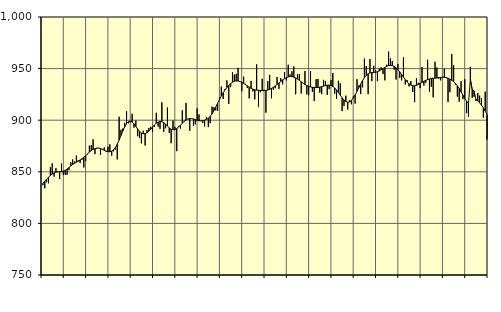
| Category | Piggar | Series 1 |
|---|---|---|
| nan | 837 | 838.9 |
| 1.0 | 834 | 840.96 |
| 1.0 | 839.9 | 842.87 |
| 1.0 | 838.9 | 844.65 |
| 1.0 | 854.4 | 846.36 |
| 1.0 | 858.2 | 847.87 |
| 1.0 | 845.3 | 848.96 |
| 1.0 | 853.5 | 849.65 |
| 1.0 | 850.2 | 849.94 |
| 1.0 | 843.1 | 850.06 |
| 1.0 | 858 | 850.23 |
| 1.0 | 846.8 | 850.65 |
| nan | 847.2 | 851.45 |
| 2.0 | 847.1 | 852.67 |
| 2.0 | 851.6 | 854.14 |
| 2.0 | 859.2 | 855.68 |
| 2.0 | 862 | 857.07 |
| 2.0 | 859.9 | 858.26 |
| 2.0 | 865.7 | 859.32 |
| 2.0 | 861.2 | 860.35 |
| 2.0 | 858.5 | 861.45 |
| 2.0 | 861.7 | 862.71 |
| 2.0 | 854.2 | 864.14 |
| 2.0 | 860.4 | 865.7 |
| nan | 866.9 | 867.37 |
| 3.0 | 875.4 | 869.02 |
| 3.0 | 875.8 | 870.52 |
| 3.0 | 881.5 | 871.74 |
| 3.0 | 867.1 | 872.55 |
| 3.0 | 872.2 | 872.94 |
| 3.0 | 873.2 | 872.95 |
| 3.0 | 866.4 | 872.54 |
| 3.0 | 871.2 | 871.82 |
| 3.0 | 873.6 | 870.94 |
| 3.0 | 869.3 | 870.08 |
| 3.0 | 874.2 | 869.51 |
| nan | 876.6 | 869.43 |
| 4.0 | 865.7 | 869.99 |
| 4.0 | 869.8 | 871.36 |
| 4.0 | 871.4 | 873.59 |
| 4.0 | 862 | 876.74 |
| 4.0 | 903.3 | 880.7 |
| 4.0 | 890.7 | 885.12 |
| 4.0 | 892 | 889.56 |
| 4.0 | 897.5 | 893.59 |
| 4.0 | 908.7 | 896.74 |
| 4.0 | 897 | 898.63 |
| 4.0 | 897.9 | 899.1 |
| nan | 906.2 | 898.25 |
| 5.0 | 892.8 | 896.38 |
| 5.0 | 899.6 | 893.91 |
| 5.0 | 884.5 | 891.32 |
| 5.0 | 882.8 | 889.13 |
| 5.0 | 877.5 | 887.59 |
| 5.0 | 889.8 | 886.86 |
| 5.0 | 875.5 | 887.01 |
| 5.0 | 890.4 | 887.88 |
| 5.0 | 892.5 | 889.34 |
| 5.0 | 893.6 | 891.27 |
| 5.0 | 888.7 | 893.39 |
| nan | 893.5 | 895.38 |
| 6.0 | 907.2 | 897.06 |
| 6.0 | 893.7 | 898.25 |
| 6.0 | 891.6 | 898.79 |
| 6.0 | 917.3 | 898.6 |
| 6.0 | 888.7 | 897.68 |
| 6.0 | 892.2 | 896.13 |
| 6.0 | 912.3 | 894.28 |
| 6.0 | 887.7 | 892.57 |
| 6.0 | 877.7 | 891.29 |
| 6.0 | 899.7 | 890.71 |
| 6.0 | 893.5 | 890.95 |
| nan | 870 | 891.92 |
| 7.0 | 894.2 | 893.39 |
| 7.0 | 891.8 | 895.15 |
| 7.0 | 909.6 | 897.02 |
| 7.0 | 899.4 | 898.79 |
| 7.0 | 916.7 | 900.19 |
| 7.0 | 900.9 | 901.18 |
| 7.0 | 889.7 | 901.67 |
| 7.0 | 901.7 | 901.61 |
| 7.0 | 894.6 | 901.2 |
| 7.0 | 896 | 900.57 |
| 7.0 | 911.4 | 899.92 |
| nan | 905.6 | 899.49 |
| 8.0 | 899.3 | 899.35 |
| 8.0 | 897.4 | 899.5 |
| 8.0 | 893.9 | 899.96 |
| 8.0 | 902.9 | 900.75 |
| 8.0 | 893.3 | 901.95 |
| 8.0 | 897.1 | 903.68 |
| 8.0 | 913.1 | 906.1 |
| 8.0 | 912.5 | 909.22 |
| 8.0 | 909.6 | 912.77 |
| 8.0 | 909.2 | 916.48 |
| 8.0 | 921.9 | 920.09 |
| nan | 932.6 | 923.45 |
| 9.0 | 920.5 | 926.51 |
| 9.0 | 930.3 | 929.25 |
| 9.0 | 938.6 | 931.67 |
| 9.0 | 915.9 | 933.79 |
| 9.0 | 932.1 | 935.52 |
| 9.0 | 946.4 | 936.84 |
| 9.0 | 944.2 | 937.75 |
| 9.0 | 944.9 | 938.07 |
| 9.0 | 950.7 | 937.96 |
| 9.0 | 937.7 | 937.51 |
| 9.0 | 928 | 936.72 |
| nan | 942.2 | 935.61 |
| 10.0 | 935.2 | 934.42 |
| 10.0 | 931.2 | 933.25 |
| 10.0 | 921.1 | 932.05 |
| 10.0 | 938.1 | 930.94 |
| 10.0 | 927.9 | 930.08 |
| 10.0 | 920.2 | 929.51 |
| 10.0 | 954.1 | 929.16 |
| 10.0 | 912.7 | 928.96 |
| 10.0 | 927.1 | 928.79 |
| 10.0 | 940.1 | 928.68 |
| 10.0 | 929.4 | 928.7 |
| nan | 907.3 | 928.88 |
| 11.0 | 937.9 | 929.25 |
| 11.0 | 943.9 | 929.88 |
| 11.0 | 921.3 | 930.77 |
| 11.0 | 929.5 | 931.86 |
| 11.0 | 931 | 933.13 |
| 11.0 | 941.8 | 934.58 |
| 11.0 | 930.4 | 936.07 |
| 11.0 | 940.9 | 937.54 |
| 11.0 | 934.7 | 939.03 |
| 11.0 | 946.6 | 940.28 |
| 11.0 | 938.5 | 941.26 |
| nan | 953.7 | 942.01 |
| 12.0 | 944.3 | 942.38 |
| 12.0 | 947.4 | 942.25 |
| 12.0 | 952.2 | 941.75 |
| 12.0 | 925.1 | 940.98 |
| 12.0 | 944.7 | 939.89 |
| 12.0 | 944.8 | 938.59 |
| 12.0 | 925.9 | 937.22 |
| 12.0 | 936.1 | 935.88 |
| 12.0 | 947.7 | 934.63 |
| 12.0 | 925 | 933.58 |
| 12.0 | 924.2 | 932.79 |
| nan | 947.6 | 932.26 |
| 13.0 | 927.5 | 931.88 |
| 13.0 | 918.5 | 931.63 |
| 13.0 | 939.7 | 931.59 |
| 13.0 | 939.9 | 931.74 |
| 13.0 | 926.7 | 932.05 |
| 13.0 | 925.3 | 932.47 |
| 13.0 | 939.1 | 933.01 |
| 13.0 | 938 | 933.56 |
| 13.0 | 924.5 | 933.94 |
| 13.0 | 930.1 | 933.98 |
| 13.0 | 938.9 | 933.64 |
| nan | 945.8 | 932.75 |
| 14.0 | 925.7 | 931.28 |
| 14.0 | 920.6 | 929.3 |
| 14.0 | 938.2 | 926.89 |
| 14.0 | 935.7 | 924.25 |
| 14.0 | 908.8 | 921.75 |
| 14.0 | 913.8 | 919.62 |
| 14.0 | 923.8 | 918.06 |
| 14.0 | 910.4 | 917.37 |
| 14.0 | 919.4 | 917.71 |
| 14.0 | 915.4 | 919.13 |
| 14.0 | 922.9 | 921.47 |
| nan | 916.1 | 924.47 |
| 15.0 | 939.7 | 927.95 |
| 15.0 | 933.6 | 931.67 |
| 15.0 | 925.3 | 935.26 |
| 15.0 | 931.9 | 938.45 |
| 15.0 | 959.7 | 941.19 |
| 15.0 | 952.3 | 943.42 |
| 15.0 | 925.2 | 944.96 |
| 15.0 | 959.3 | 945.81 |
| 15.0 | 937.9 | 946.18 |
| 15.0 | 952.7 | 946.3 |
| 15.0 | 948.5 | 946.49 |
| nan | 937.8 | 946.92 |
| 16.0 | 950 | 947.67 |
| 16.0 | 951.3 | 948.74 |
| 16.0 | 944.7 | 949.97 |
| 16.0 | 938.6 | 951.23 |
| 16.0 | 953.8 | 952.27 |
| 16.0 | 966.6 | 952.91 |
| 16.0 | 959.8 | 953.12 |
| 16.0 | 957.3 | 952.88 |
| 16.0 | 949 | 952.13 |
| 16.0 | 939.4 | 950.86 |
| 16.0 | 954.4 | 949.05 |
| nan | 941 | 946.85 |
| 17.0 | 938.6 | 944.35 |
| 17.0 | 960.9 | 941.73 |
| 17.0 | 934.6 | 939.25 |
| 17.0 | 938.8 | 937.05 |
| 17.0 | 932.7 | 935.28 |
| 17.0 | 937.9 | 934.03 |
| 17.0 | 927.4 | 933.41 |
| 17.0 | 917.5 | 933.37 |
| 17.0 | 940.6 | 933.79 |
| 17.0 | 936.3 | 934.59 |
| 17.0 | 931.1 | 935.64 |
| nan | 951.5 | 936.77 |
| 18.0 | 933.6 | 937.81 |
| 18.0 | 936.2 | 938.64 |
| 18.0 | 958.6 | 939.3 |
| 18.0 | 927.6 | 939.96 |
| 18.0 | 932.5 | 940.44 |
| 18.0 | 922.2 | 940.68 |
| 18.0 | 956.6 | 940.76 |
| 18.0 | 951 | 940.89 |
| 18.0 | 940.3 | 941.17 |
| 18.0 | 938.6 | 941.43 |
| 18.0 | 940.8 | 941.63 |
| nan | 949.9 | 941.58 |
| 19.0 | 941.8 | 941.23 |
| 19.0 | 917.7 | 940.69 |
| 19.0 | 927.1 | 939.83 |
| 19.0 | 964.2 | 938.66 |
| 19.0 | 953.3 | 937.28 |
| 19.0 | 934.5 | 935.59 |
| 19.0 | 922.9 | 933.42 |
| 19.0 | 918 | 930.67 |
| 19.0 | 937.7 | 927.5 |
| 19.0 | 920.4 | 924.24 |
| 19.0 | 939.7 | 921.05 |
| nan | 906.8 | 918.27 |
| 20.0 | 903.3 | 916.08 |
| 20.0 | 951.7 | 939.63 |
| 20.0 | 921.6 | 929.45 |
| 20.0 | 922.7 | 928.36 |
| 20.0 | 918.7 | 920.32 |
| 20.0 | 926.4 | 918.71 |
| 20.0 | 923.8 | 916.82 |
| 20.0 | 921.5 | 914.6 |
| 20.0 | 902.4 | 911.94 |
| 20.0 | 927.7 | 908.82 |
| 20.0 | 881.4 | 905.4 |